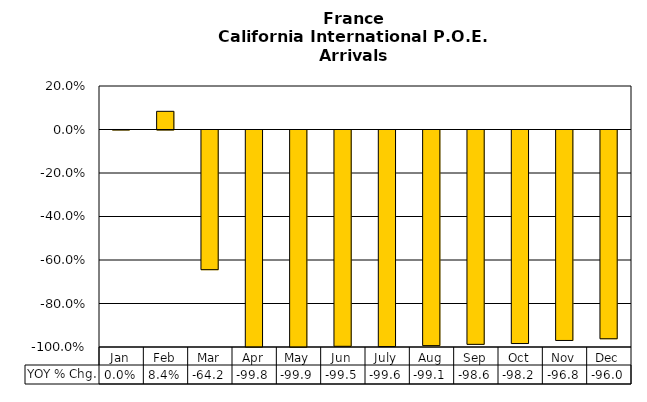
| Category | YOY % Chg. |
|---|---|
| Jan | 0 |
| Feb | 0.084 |
| Mar | -0.642 |
| Apr | -0.998 |
| May | -0.999 |
| Jun | -0.995 |
| July | -0.996 |
| Aug | -0.991 |
| Sep | -0.986 |
| Oct | -0.982 |
| Nov | -0.968 |
| Dec | -0.96 |